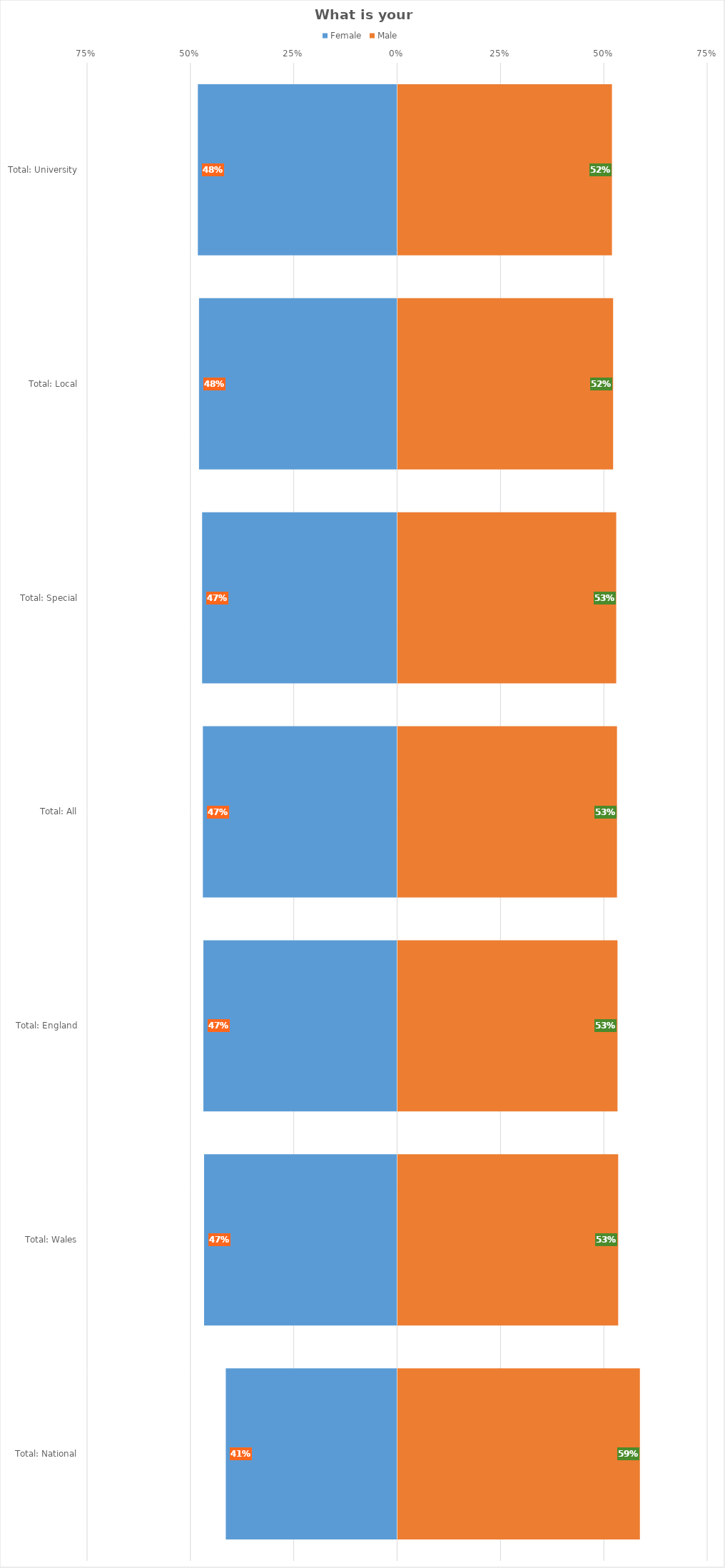
| Category | Female | Male |
|---|---|---|
| Total: University | -0.482 | 0.518 |
| Total: Local | -0.479 | 0.521 |
| Total: Special | -0.472 | 0.528 |
| Total: All | -0.47 | 0.53 |
| Total: England | -0.469 | 0.531 |
| Total: Wales | -0.467 | 0.533 |
| Total: National | -0.414 | 0.586 |